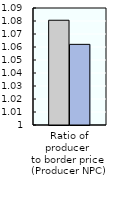
| Category | 2000-02 | 2018-20 |
|---|---|---|
| Ratio of producer 
to border price 
(Producer NPC) | 1.081 | 1.062 |